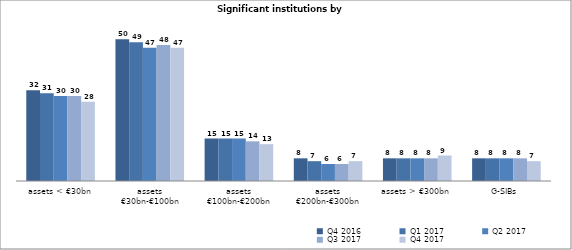
| Category | Q4 2016 | Q1 2017 | Q2 2017 | Q3 2017 | Q4 2017 |
|---|---|---|---|---|---|
| assets < €30bn | 32 | 31 | 30 | 30 | 28 |
| assets
€30bn-€100bn | 50 | 49 | 47 | 48 | 47 |
| assets
€100bn-€200bn | 15 | 15 | 15 | 14 | 13 |
| assets
€200bn-€300bn | 8 | 7 | 6 | 6 | 7 |
| assets > €300bn | 8 | 8 | 8 | 8 | 9 |
| G-SIBs | 8 | 8 | 8 | 8 | 7 |